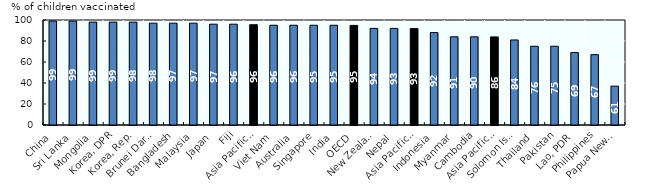
| Category | Series 0 |
|---|---|
| Papua New Guinea | 37 |
| Philippines | 67 |
| Lao, PDR | 69 |
| Pakistan | 75 |
| Thailand | 75 |
| Solomon Islands | 81 |
| Asia Pacific-LM/L | 83.9 |
| Cambodia | 84 |
| Myanmar | 84 |
| Indonesia | 88 |
| Asia Pacific-UM | 91.8 |
| Nepal | 92 |
| New Zealand | 92 |
| OECD | 94.838 |
| India | 95 |
| Singapore | 95 |
| Australia | 95 |
| Viet Nam | 95 |
| Asia Pacific-H | 95.5 |
| Fiji | 96 |
| Japan | 96 |
| Malaysia | 97 |
| Bangladesh | 97 |
| Brunei Darussalam | 97 |
| Korea, Rep. | 98 |
| Korea, DPR | 98 |
| Mongolia | 98 |
| Sri Lanka | 99 |
| China | 99 |